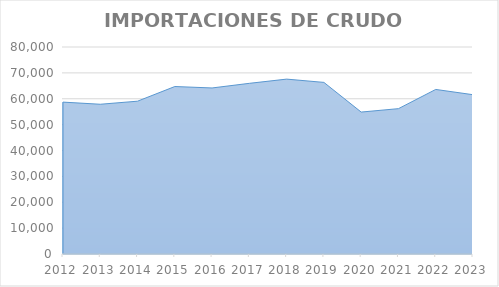
| Category | Series 0 |
|---|---|
| 2012.0 | 58697 |
| 2013.0 | 57871 |
| 2014.0 | 59054 |
| 2015.0 | 64726 |
| 2016.0 | 64171 |
| 2017.0 | 65958 |
| 2018.0 | 67586 |
| 2019.0 | 66319 |
| 2020.0 | 54852 |
| 2021.0 | 56171.787 |
| 2022.0 | 63595.529 |
| 2023.0 | 61558.654 |